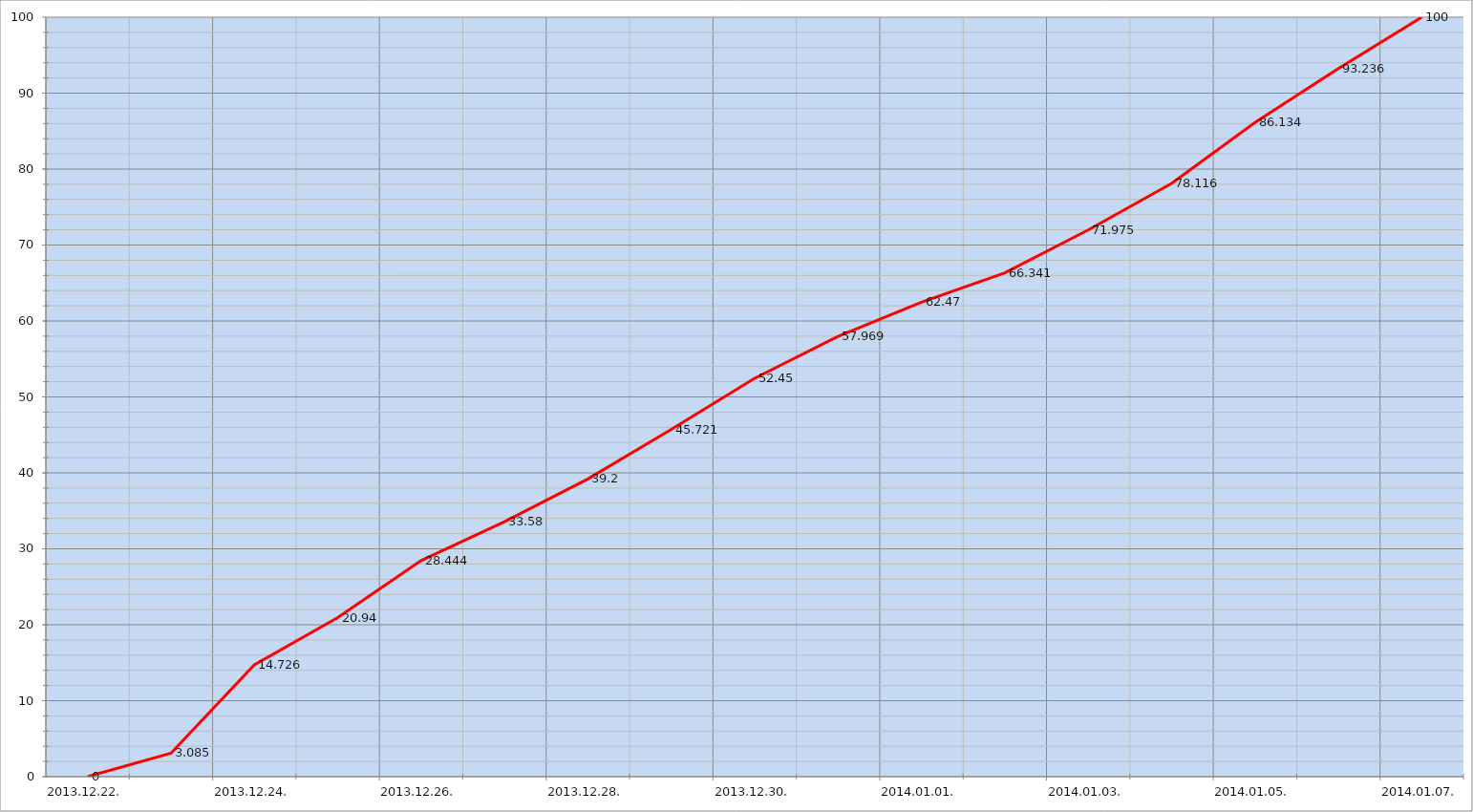
| Category | Szerver 8 |
|---|---|
| 2013-12-22 | 0 |
| 2013-12-23 | 3.085 |
| 2013-12-24 | 14.726 |
| 2013-12-25 | 20.94 |
| 2013-12-26 | 28.444 |
| 2013-12-27 | 33.58 |
| 2013-12-28 | 39.2 |
| 2013-12-29 | 45.721 |
| 2013-12-30 | 52.45 |
| 2013-12-31 | 57.969 |
| 2014-01-01 | 62.47 |
| 2014-01-02 | 66.341 |
| 2014-01-03 | 71.975 |
| 2014-01-04 | 78.116 |
| 2014-01-05 | 86.134 |
| 2014-01-06 | 93.236 |
| 2014-01-07 | 100 |